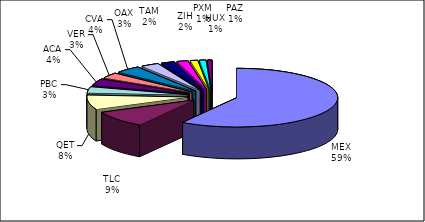
| Category | Series 0 |
|---|---|
| MEX | 502152 |
| TLC | 78408 |
| QET | 66944 |
| PBC | 28232 |
| ACA | 32058 |
| VER | 25897 |
| CVA | 34518 |
| OAX | 24408 |
| TAM | 18032 |
| ZIH | 15253 |
| HUX | 10127 |
| PXM | 8772 |
| PAZ | 6268 |